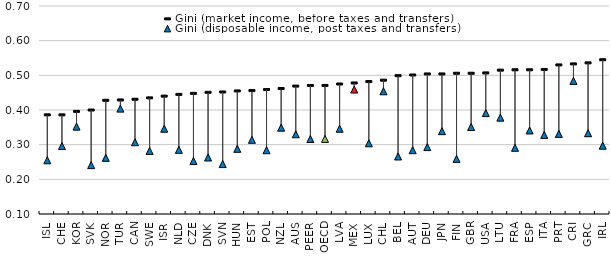
| Category | Gini (market income, before taxes and transfers) | Gini (disposable income, post taxes and transfers) |
|---|---|---|
| ISL | 0.386 | 0.255 |
| CHE | 0.386 | 0.296 |
| KOR | 0.396 | 0.352 |
| SVK | 0.4 | 0.241 |
| NOR | 0.428 | 0.262 |
| TUR | 0.429 | 0.404 |
| CAN | 0.431 | 0.307 |
| SWE | 0.435 | 0.282 |
| ISR | 0.44 | 0.346 |
| NLD | 0.445 | 0.285 |
| CZE | 0.448 | 0.253 |
| DNK | 0.451 | 0.263 |
| SVN | 0.452 | 0.244 |
| HUN | 0.455 | 0.288 |
| EST | 0.456 | 0.314 |
| POL | 0.459 | 0.284 |
| NZL | 0.462 | 0.349 |
| AUS | 0.469 | 0.33 |
| PEER | 0.471 | 0.316 |
| OECD | 0.471 | 0.317 |
| LVA | 0.475 | 0.346 |
| MEX | 0.478 | 0.459 |
| LUX | 0.482 | 0.304 |
| CHL | 0.486 | 0.454 |
| BEL | 0.499 | 0.266 |
| AUT | 0.501 | 0.284 |
| DEU | 0.504 | 0.293 |
| JPN | 0.504 | 0.339 |
| FIN | 0.506 | 0.259 |
| GBR | 0.506 | 0.351 |
| USA | 0.507 | 0.391 |
| LTU | 0.515 | 0.378 |
| FRA | 0.516 | 0.291 |
| ESP | 0.516 | 0.341 |
| ITA | 0.517 | 0.328 |
| PRT | 0.53 | 0.331 |
| CRI | 0.533 | 0.484 |
| GRC | 0.536 | 0.333 |
| IRL | 0.545 | 0.297 |